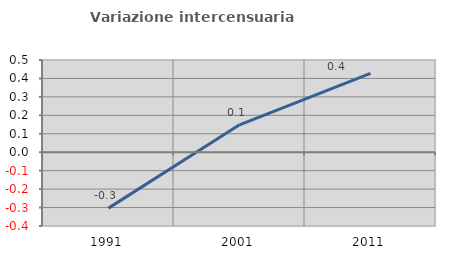
| Category | Variazione intercensuaria annua |
|---|---|
| 1991.0 | -0.303 |
| 2001.0 | 0.148 |
| 2011.0 | 0.427 |